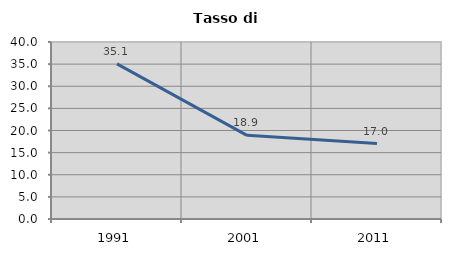
| Category | Tasso di disoccupazione   |
|---|---|
| 1991.0 | 35.055 |
| 2001.0 | 18.904 |
| 2011.0 | 17.038 |